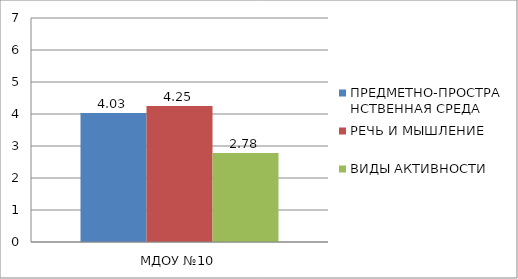
| Category | ПРЕДМЕТНО-ПРОСТРАНСТВЕННАЯ СРЕДА | РЕЧЬ И МЫШЛЕНИЕ | ВИДЫ АКТИВНОСТИ |
|---|---|---|---|
| МДОУ №10 | 4.03 | 4.25 | 2.78 |